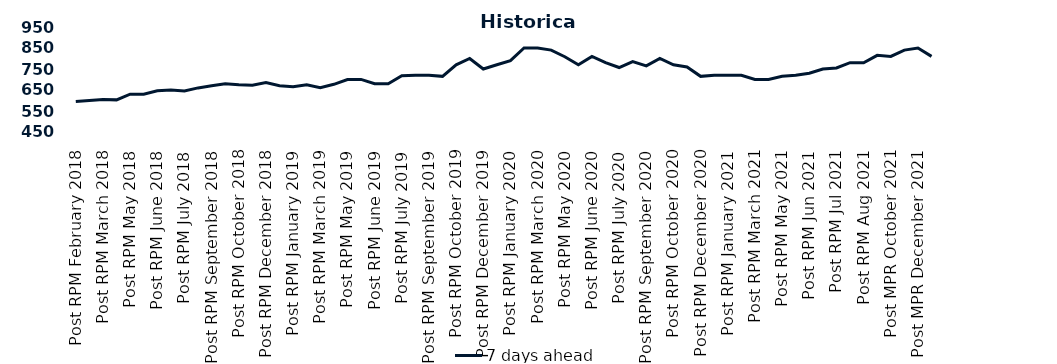
| Category | 7 days ahead |
|---|---|
| Post RPM February 2018 | 595 |
| Pre RPM March 2018 | 600 |
| Post RPM March 2018 | 605 |
| Pre RPM May 2018 | 603 |
| Post RPM May 2018 | 630 |
| Pre RPM June 2018 | 630 |
| Post RPM June 2018 | 646.5 |
| Pre RPM July 2018 | 650 |
| Post RPM July 2018 | 645 |
| Pre RPM September 2018 | 660 |
| Post RPM September 2018 | 670 |
| Pre RPM October 2018 | 680 |
| Post RPM October 2018 | 675 |
| Pre RPM December 2018 | 672.5 |
| Post RPM December 2018 | 685 |
| Pre RPM January 2019 | 670 |
| Post RPM January 2019 | 665 |
| Pre RPM March 2019 | 675 |
| Post RPM March 2019 | 661 |
| Pre RPM May 2019 | 677 |
| Post RPM May 2019 | 700 |
| Pre RPM June 2019 | 700.5 |
| Post RPM June 2019 | 680 |
| Pre RPM July 2019 | 680 |
| Post RPM July 2019 | 717.5 |
| Pre RPM September 2019 | 720 |
| Post RPM September 2019 | 720 |
| Pre RPM October 2019 | 715 |
| Post RPM October 2019 | 770 |
| Pre RPM December 2019 | 800 |
| Post RPM December 2019 | 750 |
| Pre RPM January 2020 | 770 |
| Post RPM January 2020 | 790 |
| Pre RPM March 2020 | 850 |
| Post RPM March 2020 | 850 |
| Pre RPM May 2020 | 840 |
| Post RPM May 2020 | 808.5 |
| Pre RPM June 2020 | 770 |
| Post RPM June 2020 | 810 |
| Pre RPM July 2020 | 780 |
| Post RPM July 2020 | 757 |
| Pre RPM September 2020 | 785 |
| Post RPM September 2020 | 765 |
| Pre RPM October 2020 | 800 |
| Post RPM October 2020 | 770 |
| Pre RPM December 2020 | 760 |
|  Post RPM December 2020 | 715 |
| Pre RPM January 2021 | 720 |
| Post RPM January 2021 | 720 |
|  Pre RPM March 2021 | 720 |
|  Post RPM March 2021 | 700 |
|  Pre RPM May 2021 | 700 |
|  Post RPM May 2021 | 715 |
|  Pre RPM Jun 2021 | 720 |
|   Post RPM Jun 2021 | 730 |
| Pre RPM Jul 2021 | 750 |
|  Post RPM Jul 2021 | 755 |
| Pre RPM Aug 2021 | 780 |
|  Post RPM Aug 2021 | 780 |
| Pre MPR October 2021 | 815 |
| Post MPR October 2021 | 810 |
| Pre MPR December 2021 | 840 |
| Post MPR December 2021 | 850 |
| Pre MPR January 2022 | 810 |